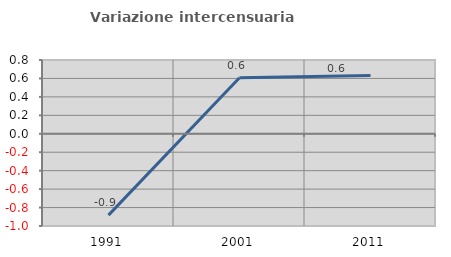
| Category | Variazione intercensuaria annua |
|---|---|
| 1991.0 | -0.882 |
| 2001.0 | 0.608 |
| 2011.0 | 0.633 |